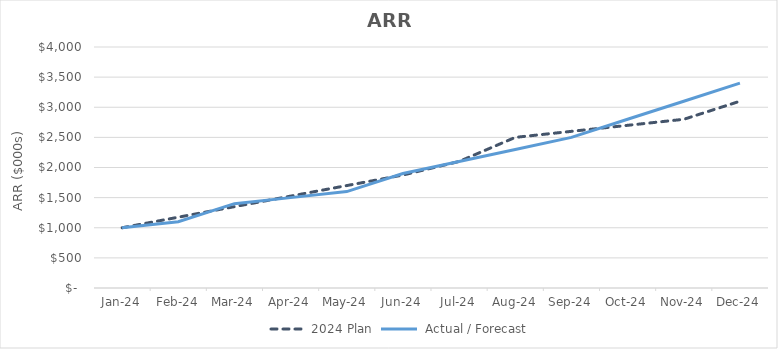
| Category | 2024 Plan |  Actual / Forecast |
|---|---|---|
| 2024-01-31 | 1000 | 1000 |
| 2024-02-29 | 1175 | 1100 |
| 2024-03-31 | 1350 | 1400 |
| 2024-04-30 | 1525 | 1500 |
| 2024-05-31 | 1700 | 1600 |
| 2024-06-30 | 1875 | 1900 |
| 2024-07-31 | 2100 | 2100 |
| 2024-08-31 | 2500 | 2300 |
| 2024-09-30 | 2600 | 2500 |
| 2024-10-31 | 2700 | 2800 |
| 2024-11-30 | 2800 | 3100 |
| 2024-12-31 | 3100 | 3400 |